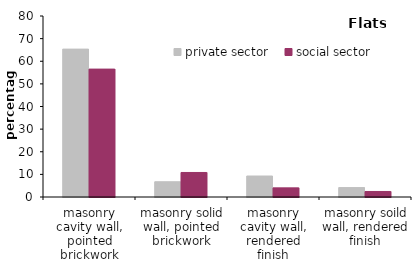
| Category | private sector | social sector |
|---|---|---|
| masonry cavity wall, pointed brickwork | 65.362 | 56.527 |
| masonry solid wall, pointed brickwork | 6.738 | 10.839 |
| masonry cavity wall, rendered finish | 9.27 | 4.043 |
| masonry soild wall, rendered finish | 4.171 | 2.44 |